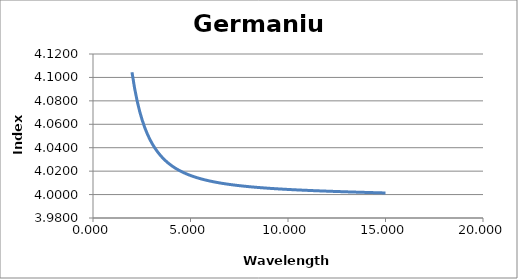
| Category | Germanium |
|---|---|
| 2.0 | 4.104 |
| 2.131313 | 4.091 |
| 2.262626 | 4.08 |
| 2.393939 | 4.071 |
| 2.525253 | 4.063 |
| 2.656566 | 4.057 |
| 2.787879 | 4.052 |
| 2.919192 | 4.047 |
| 3.050505 | 4.043 |
| 3.181818 | 4.039 |
| 3.313131 | 4.036 |
| 3.444444 | 4.034 |
| 3.575758 | 4.031 |
| 3.707071 | 4.029 |
| 3.838384 | 4.027 |
| 3.969697 | 4.025 |
| 4.10101 | 4.024 |
| 4.232323 | 4.022 |
| 4.363636 | 4.021 |
| 4.494949 | 4.02 |
| 4.626263 | 4.019 |
| 4.757576 | 4.018 |
| 4.888889 | 4.017 |
| 5.020202 | 4.016 |
| 5.151515 | 4.015 |
| 5.282828 | 4.015 |
| 5.414141 | 4.014 |
| 5.545455 | 4.013 |
| 5.676768 | 4.013 |
| 5.808081 | 4.012 |
| 5.939394 | 4.012 |
| 6.070707 | 4.011 |
| 6.20202 | 4.011 |
| 6.333333 | 4.01 |
| 6.464646 | 4.01 |
| 6.59596 | 4.01 |
| 6.727273 | 4.009 |
| 6.858586 | 4.009 |
| 6.989899 | 4.009 |
| 7.121212 | 4.008 |
| 7.252525 | 4.008 |
| 7.383838 | 4.008 |
| 7.515152 | 4.008 |
| 7.646465 | 4.007 |
| 7.777778 | 4.007 |
| 7.909091 | 4.007 |
| 8.040404 | 4.007 |
| 8.171717 | 4.006 |
| 8.30303 | 4.006 |
| 8.434343 | 4.006 |
| 8.565657 | 4.006 |
| 8.69697 | 4.006 |
| 8.828283 | 4.006 |
| 8.959596 | 4.005 |
| 9.090909 | 4.005 |
| 9.222222 | 4.005 |
| 9.353535 | 4.005 |
| 9.484848 | 4.005 |
| 9.616162 | 4.005 |
| 9.747475 | 4.005 |
| 9.878788 | 4.004 |
| 10.0101 | 4.004 |
| 10.14141 | 4.004 |
| 10.27273 | 4.004 |
| 10.40404 | 4.004 |
| 10.53535 | 4.004 |
| 10.66667 | 4.004 |
| 10.79798 | 4.004 |
| 10.92929 | 4.004 |
| 11.06061 | 4.004 |
| 11.19192 | 4.003 |
| 11.32323 | 4.003 |
| 11.45455 | 4.003 |
| 11.58586 | 4.003 |
| 11.71717 | 4.003 |
| 11.84848 | 4.003 |
| 11.9798 | 4.003 |
| 12.11111 | 4.003 |
| 12.24242 | 4.003 |
| 12.37374 | 4.003 |
| 12.50505 | 4.003 |
| 12.63636 | 4.003 |
| 12.76768 | 4.002 |
| 12.89899 | 4.002 |
| 13.0303 | 4.002 |
| 13.16162 | 4.002 |
| 13.29293 | 4.002 |
| 13.42424 | 4.002 |
| 13.55556 | 4.002 |
| 13.68687 | 4.002 |
| 13.81818 | 4.002 |
| 13.94949 | 4.002 |
| 14.08081 | 4.002 |
| 14.21212 | 4.002 |
| 14.34343 | 4.002 |
| 14.47475 | 4.002 |
| 14.60606 | 4.002 |
| 14.73737 | 4.001 |
| 14.86869 | 4.001 |
| 15.0 | 4.001 |